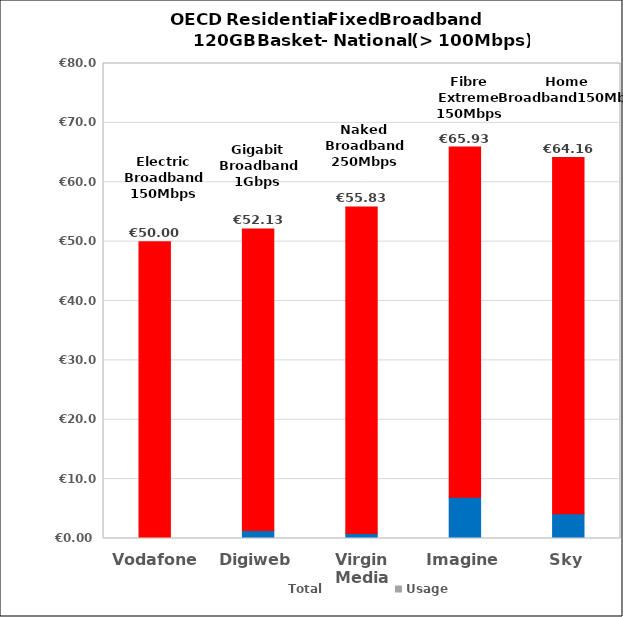
| Category | Non-rec | Monthly | Usage | Total |
|---|---|---|---|---|
| Vodafone  | 0 | 50 | 0 | 50 |
| Digiweb | 1.361 | 50.77 | 0 | 52.13 |
| Virgin Media | 0.833 | 55 | 0 | 55.83 |
| Imagine | 6.94 | 58.99 | 0 | 65.93 |
| Sky | 4.167 | 59.99 | 0 | 64.157 |